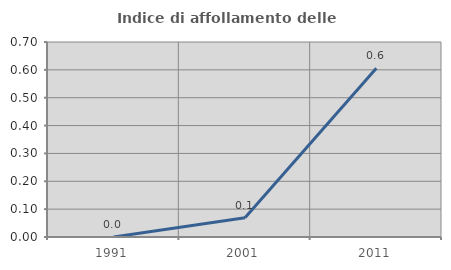
| Category | Indice di affollamento delle abitazioni  |
|---|---|
| 1991.0 | 0 |
| 2001.0 | 0.069 |
| 2011.0 | 0.605 |